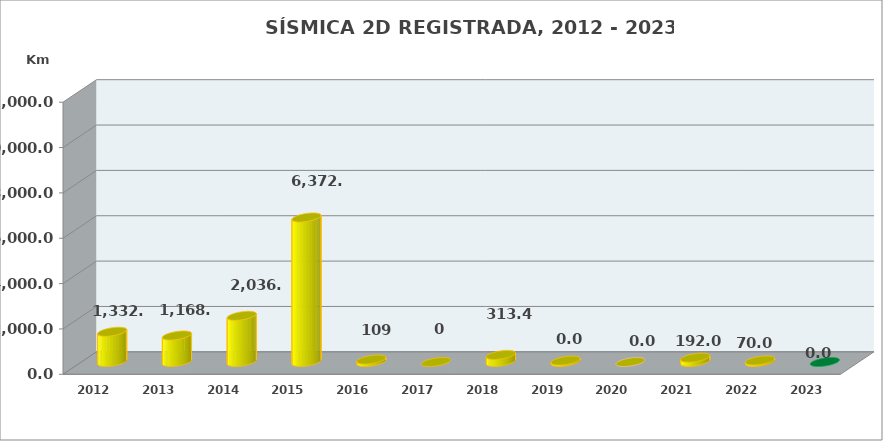
| Category | Series 0 |
|---|---|
| 2012.0 | 1332.85 |
| 2013.0 | 1168 |
| 2014.0 | 2036 |
| 2015.0 | 6372.61 |
| 2016.0 | 109 |
| 2017.0 | 0 |
| 2018.0 | 313.4 |
| 2019.0 | 63.22 |
| 2020.0 | 0 |
| 2021.0 | 191.95 |
| 2022.0 | 70 |
| 2023.0 | 0 |